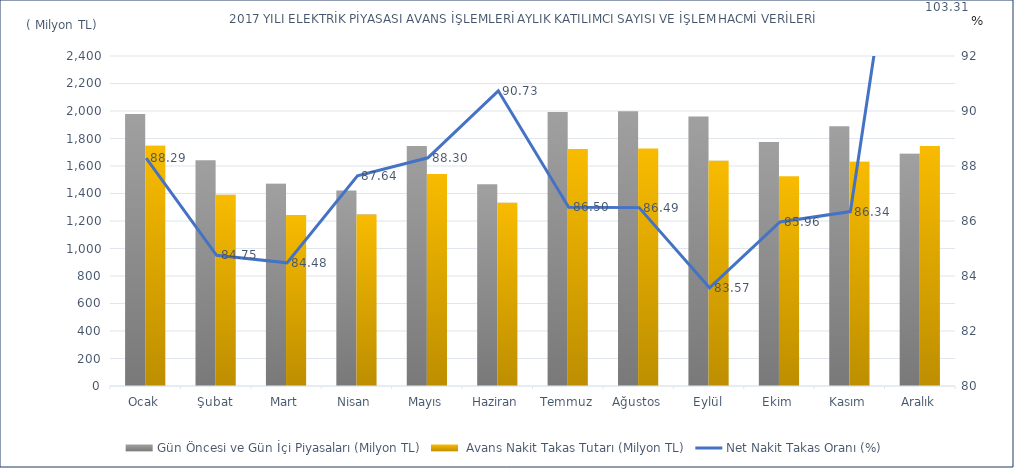
| Category | Gün Öncesi ve Gün İçi Piyasaları (Milyon TL) |  Avans Nakit Takas Tutarı (Milyon TL) |
|---|---|---|
| Ocak | 1978.638 | 1746.93 |
| Şubat | 1641.881 | 1391.538 |
| Mart | 1471.507 | 1243.11 |
| Nisan | 1422.618 | 1246.781 |
| Mayıs | 1746.189 | 1541.839 |
| Haziran | 1468.148 | 1332.097 |
| Temmuz | 1993 | 1724 |
| Ağustos | 1998 | 1728 |
| Eylül | 1960 | 1638 |
| Ekim | 1774 | 1525 |
| Kasım | 1889 | 1631 |
| Aralık | 1690 | 1746 |